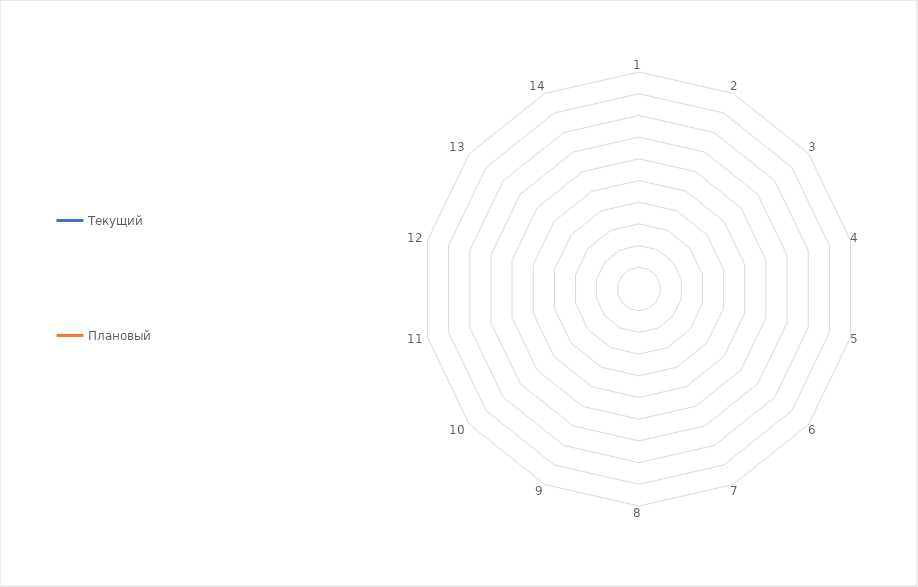
| Category | Текущий | Плановый |
|---|---|---|
| 1.0 | 0 | 0 |
| 2.0 | 0 | 0 |
| 3.0 | 0 | 0 |
| 4.0 | 0 | 0 |
| 5.0 | 0 | 0 |
| 6.0 | 0 | 0 |
| 7.0 | 0 | 0 |
| 8.0 | 0 | 0 |
| 9.0 | 0 | 0 |
| 10.0 | 0 | 0 |
| 11.0 | 0 | 0 |
| 12.0 | 0 | 0 |
| 13.0 | 0 | 0 |
| 14.0 | 0 | 0 |